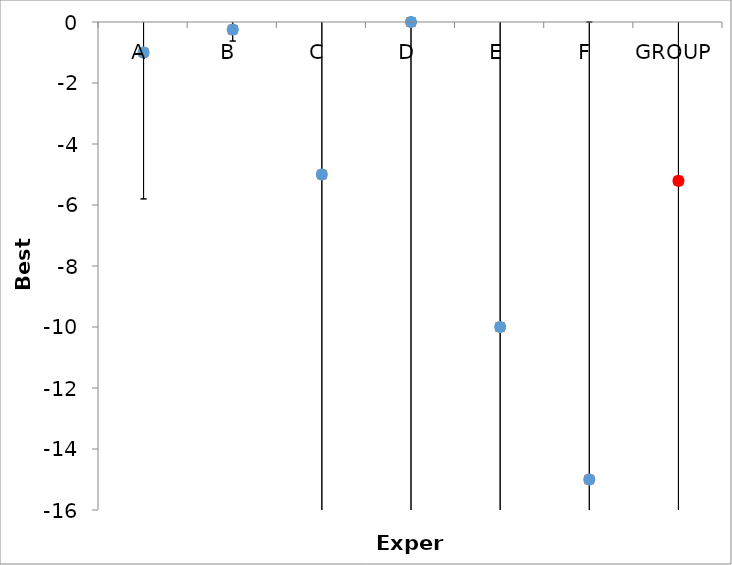
| Category | Series 1 | Series 0 |
|---|---|---|
| A | -1 | -1 |
| B | -0.25 | -0.25 |
| C | -5 | -5 |
| D | 0 | 0 |
| E | -10 | -10 |
| F | -15 | -15 |
| GROUP | -5.208 | -5.208 |